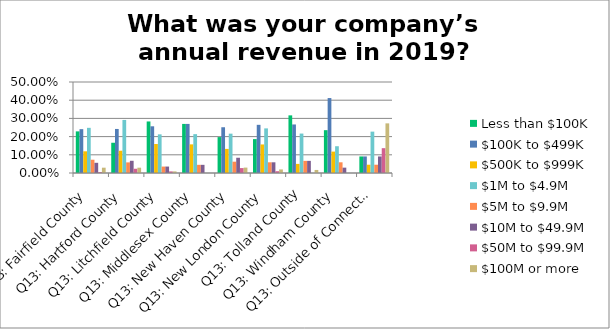
| Category | Less than $100K | $100K to $499K | $500K to $999K | $1M to $4.9M | $5M to $9.9M | $10M to $49.9M | $50M to $99.9M | $100M or more |
|---|---|---|---|---|---|---|---|---|
| Q13: Fairfield County | 0.229 | 0.241 | 0.119 | 0.248 | 0.073 | 0.056 | 0.005 | 0.029 |
| Q13: Hartford County | 0.166 | 0.242 | 0.122 | 0.292 | 0.058 | 0.067 | 0.023 | 0.029 |
| Q13: Litchfield County | 0.283 | 0.257 | 0.159 | 0.212 | 0.035 | 0.035 | 0.009 | 0.009 |
| Q13: Middlesex County | 0.27 | 0.27 | 0.157 | 0.214 | 0.045 | 0.045 | 0 | 0 |
| Q13: New Haven County | 0.197 | 0.251 | 0.132 | 0.216 | 0.062 | 0.084 | 0.027 | 0.03 |
| Q13: New London County | 0.186 | 0.265 | 0.157 | 0.245 | 0.059 | 0.059 | 0.01 | 0.02 |
| Q13: Tolland County | 0.317 | 0.267 | 0.05 | 0.217 | 0.067 | 0.067 | 0 | 0.017 |
| Q13: Windham County | 0.235 | 0.412 | 0.118 | 0.147 | 0.059 | 0.029 | 0 | 0 |
| Q13: Outside of Connecticut | 0.091 | 0.091 | 0.046 | 0.227 | 0.046 | 0.091 | 0.136 | 0.273 |